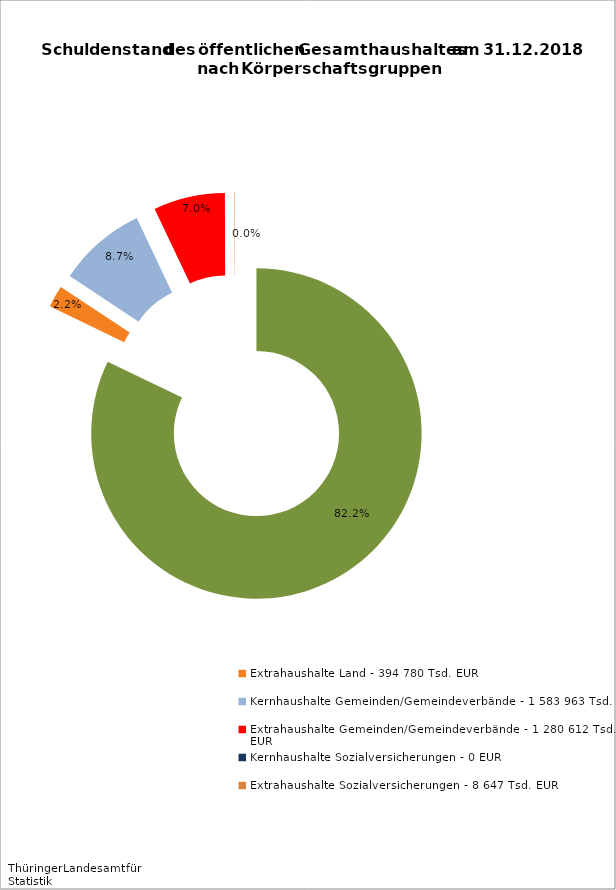
| Category | Series 0 |
|---|---|
| Kernhaushalt Land - 15 041 750 Tsd. EUR | 15041749.676 |
| Extrahaushalte Land - 394 780 Tsd. EUR | 394779.884 |
| Kernhaushalte Gemeinden/Gemeindeverbände - 1 583 963 Tsd. EUR | 1583963.472 |
| Extrahaushalte Gemeinden/Gemeindeverbände - 1 280 612 Tsd. EUR | 1280611.949 |
| Kernhaushalte Sozialversicherungen - 0 EUR | 0 |
| Extrahaushalte Sozialversicherungen - 8 647 Tsd. EUR | 8647.286 |